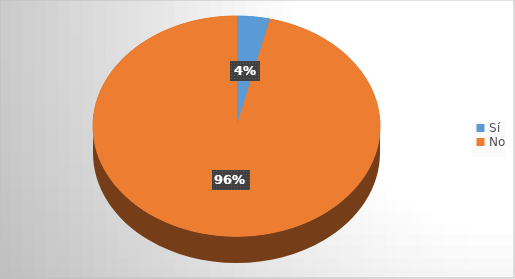
| Category | Series 0 |
|---|---|
| Sí | 50 |
| No | 1291 |